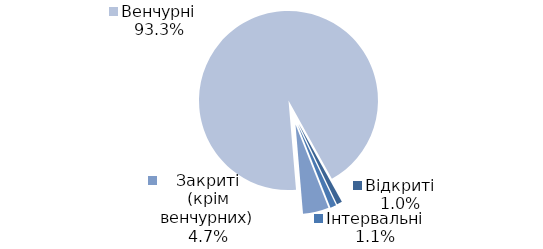
| Category | Series 0 |
|---|---|
| Відкриті | 17 |
| Інтервальні | 19 |
| Закриті (крім венчурних) | 82 |
| Венчурні | 1639 |